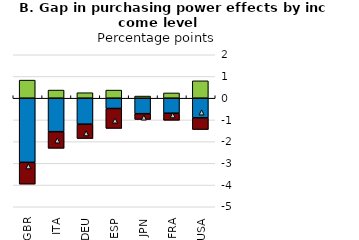
| Category | Energy | Food | Other: (non-food, non-energy) |
|---|---|---|---|
| GBR | -2.954 | -1.003 | 0.832 |
| ITA | -1.542 | -0.766 | 0.374 |
| DEU | -1.197 | -0.66 | 0.252 |
| ESP | -0.474 | -0.917 | 0.373 |
| JPN | -0.713 | -0.267 | 0.098 |
| FRA | -0.693 | -0.325 | 0.242 |
| USA | -0.906 | -0.538 | 0.8 |